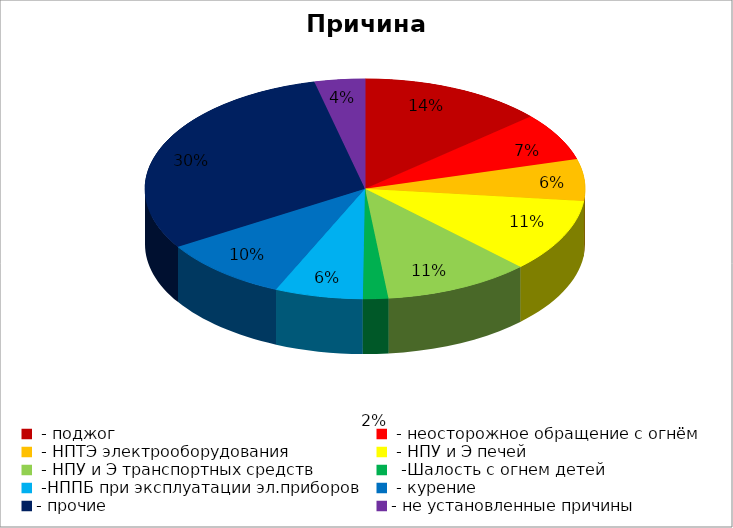
| Category | Причина пожара |
|---|---|
|  - поджог | 44 |
|  - неосторожное обращение с огнём | 23 |
|  - НПТЭ электрооборудования | 20 |
|  - НПУ и Э печей | 35 |
|  - НПУ и Э транспортных средств | 35 |
|   -Шалость с огнем детей | 6 |
|  -НППБ при эксплуатации эл.приборов | 21 |
|  - курение | 31 |
| - прочие | 98 |
| - не установленные причины | 12 |